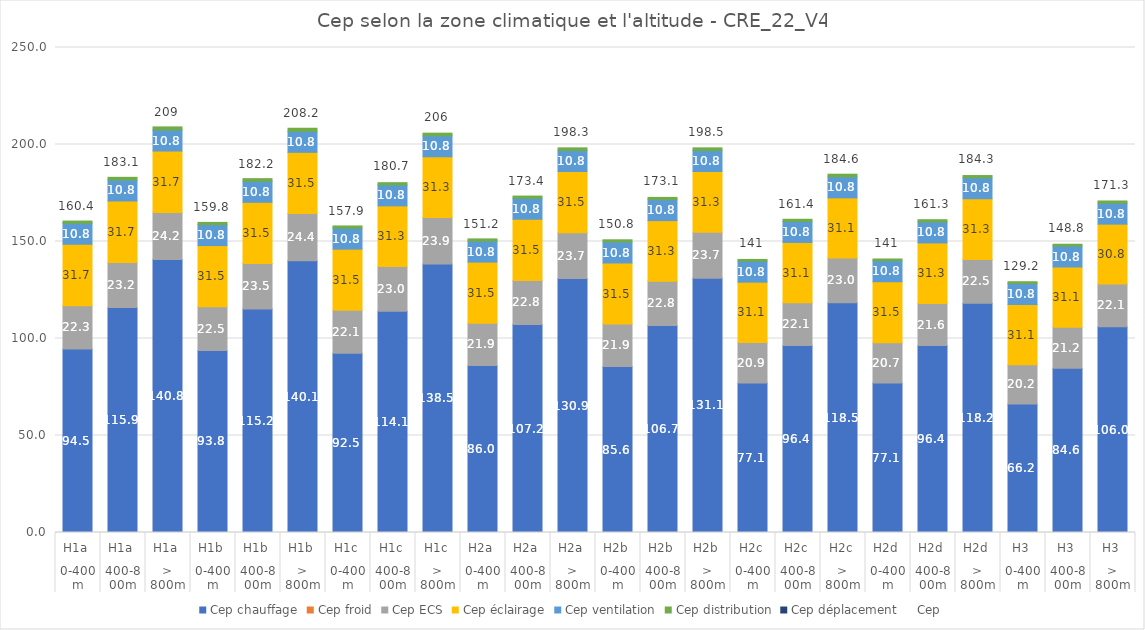
| Category | Cep chauffage | Cep froid | Cep ECS | Cep éclairage | Cep ventilation | Cep distribution | Cep déplacement |
|---|---|---|---|---|---|---|---|
| 0 | 94.53 | 0 | 22.31 | 31.74 | 10.81 | 1.15 | 0 |
| 1 | 115.92 | 0 | 23.23 | 31.74 | 10.81 | 1.38 | 0 |
| 2 | 140.76 | 0 | 24.15 | 31.74 | 10.81 | 1.61 | 0 |
| 3 | 93.84 | 0 | 22.54 | 31.51 | 10.81 | 1.15 | 0 |
| 4 | 115.23 | 0 | 23.46 | 31.51 | 10.81 | 1.38 | 0 |
| 5 | 140.07 | 0 | 24.38 | 31.51 | 10.81 | 1.61 | 0 |
| 6 | 92.46 | 0 | 22.08 | 31.51 | 10.81 | 1.15 | 0 |
| 7 | 114.08 | 0 | 23 | 31.28 | 10.81 | 1.15 | 0 |
| 8 | 138.46 | 0 | 23.92 | 31.28 | 10.81 | 1.38 | 0 |
| 9 | 86.02 | 0 | 21.85 | 31.51 | 10.81 | 1.15 | 0 |
| 10 | 107.18 | 0 | 22.77 | 31.51 | 10.81 | 1.15 | 0 |
| 11 | 130.87 | 0 | 23.69 | 31.51 | 10.81 | 1.38 | 0 |
| 12 | 85.56 | 0 | 21.85 | 31.51 | 10.81 | 1.15 | 0 |
| 13 | 106.72 | 0 | 22.77 | 31.28 | 10.81 | 1.15 | 0 |
| 14 | 131.1 | 0 | 23.69 | 31.28 | 10.81 | 1.38 | 0 |
| 15 | 77.05 | 0 | 20.93 | 31.05 | 10.81 | 0.92 | 0 |
| 16 | 96.37 | 0 | 22.08 | 31.05 | 10.81 | 1.15 | 0 |
| 17 | 118.45 | 0 | 23 | 31.05 | 10.81 | 1.38 | 0 |
| 18 | 77.05 | 0 | 20.7 | 31.51 | 10.81 | 0.92 | 0 |
| 19 | 96.37 | 0 | 21.62 | 31.28 | 10.81 | 1.15 | 0 |
| 20 | 118.22 | 0 | 22.54 | 31.28 | 10.81 | 1.15 | 0 |
| 21 | 66.24 | 0 | 20.24 | 31.05 | 10.81 | 0.92 | 0 |
| 22 | 84.64 | 0 | 21.16 | 31.05 | 10.81 | 0.92 | 0 |
| 23 | 106.03 | 0 | 22.08 | 30.82 | 10.81 | 1.15 | 0 |